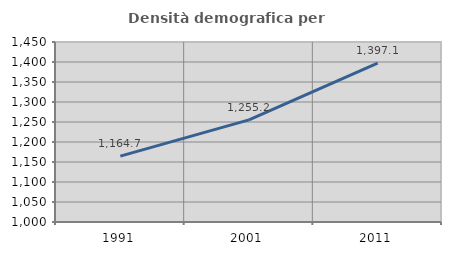
| Category | Densità demografica |
|---|---|
| 1991.0 | 1164.749 |
| 2001.0 | 1255.227 |
| 2011.0 | 1397.125 |